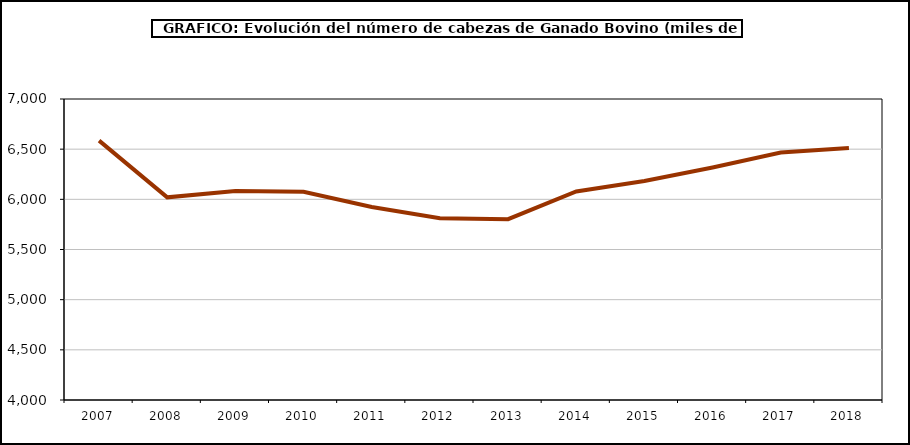
| Category | Series 0 |
|---|---|
| 2007.0 | 6584.98 |
| 2008.0 | 6020 |
| 2009.0 | 6082.442 |
| 2010.0 | 6075 |
| 2011.0 | 5923 |
| 2012.0 | 5812.605 |
| 2013.0 | 5802.22 |
| 2014.0 | 6078.733 |
| 2015.0 | 6182.908 |
| 2016.0 | 6317.641 |
| 2017.0 | 6465.747 |
| 2018.0 | 6510.592 |